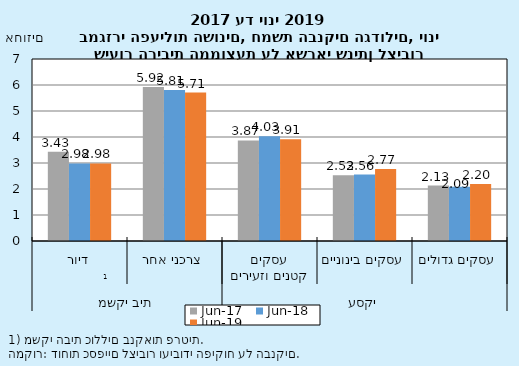
| Category | יונ-17 | יונ-18 | יונ-19 |
|---|---|---|---|
| 0 | 3.428 | 2.982 | 2.984 |
| 1 | 5.923 | 5.812 | 5.707 |
| 2 | 3.866 | 4.029 | 3.909 |
| 3 | 2.533 | 2.556 | 2.766 |
| 4 | 2.131 | 2.088 | 2.196 |